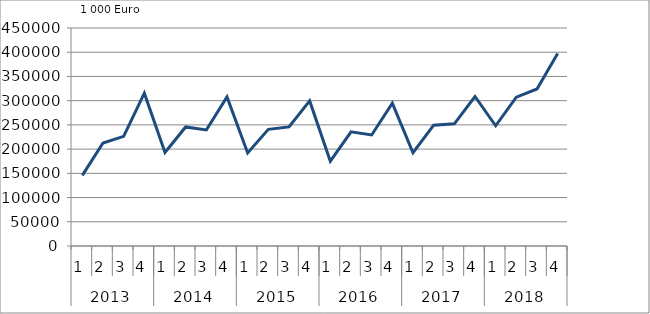
| Category | Ausbaugewerblicher Umsatz3 |
|---|---|
| 0 | 145792.596 |
| 1 | 212577 |
| 2 | 226327.748 |
| 3 | 315433.896 |
| 4 | 193004.858 |
| 5 | 245754.159 |
| 6 | 239547.85 |
| 7 | 307688.935 |
| 8 | 192043.756 |
| 9 | 240826.879 |
| 10 | 245916.087 |
| 11 | 299455.378 |
| 12 | 175225.59 |
| 13 | 235781.631 |
| 14 | 229227.559 |
| 15 | 294992.157 |
| 16 | 192499.539 |
| 17 | 249394.388 |
| 18 | 252146.755 |
| 19 | 308653.153 |
| 20 | 248133.418 |
| 21 | 307099.899 |
| 22 | 324088.989 |
| 23 | 397377.201 |